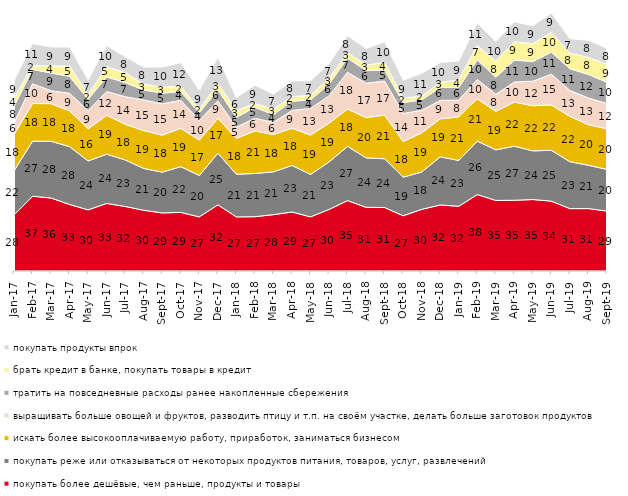
| Category | покупать более дешёвые, чем раньше, продукты и товары | покупать реже или отказываться от некоторых продуктов питания, товаров, услуг, развлечений | искать более высокооплачиваемую работу, приработок, заниматься бизнесом | выращивать больше овощей и фруктов, разводить птицу и т.п. на своём участке, делать больше заготовок продуктов  | тратить на повседневные расходы ранее накопленные сбережения | брать кредит в банке, покупать товары в кредит | покупать продукты впрок |
|---|---|---|---|---|---|---|---|
| 2017-01-01 | 27.5 | 21.65 | 17.8 | 5.7 | 8.15 | 3.75 | 8.85 |
| 2017-02-01 | 36.7 | 27 | 18.45 | 9.7 | 7.05 | 1.85 | 10.8 |
| 2017-03-01 | 35.8 | 27.85 | 18.45 | 6.35 | 8.7 | 3.5 | 9.25 |
| 2017-04-01 | 32.65 | 28.35 | 17.55 | 8.6 | 8.35 | 4.95 | 9.4 |
| 2017-05-01 | 30 | 24 | 15.75 | 8.9 | 5.6 | 2.2 | 7.3 |
| 2017-06-01 | 33.15 | 24.15 | 19.1 | 11.65 | 7.2 | 5 | 10.35 |
| 2017-07-01 | 31.65 | 22.85 | 17.5 | 13.5 | 6.9 | 4.95 | 7.75 |
| 2017-08-01 | 29.8 | 20.5 | 18.6 | 15 | 4.95 | 2.75 | 8.45 |
| 2017-09-01 | 28.5 | 20 | 18.15 | 15.35 | 5.25 | 3 | 9.85 |
| 2017-10-01 | 28.75 | 22.45 | 18.8 | 13.75 | 4.3 | 2.45 | 11.7 |
| 2017-11-01 | 26.55 | 20.3 | 17.4 | 9.6 | 3.8 | 1.7 | 9.3 |
| 2017-12-01 | 32.45 | 25.35 | 17.1 | 8.55 | 5.55 | 3.05 | 12.7 |
| 2018-01-01 | 26.55 | 20.95 | 17.6 | 5.45 | 4.85 | 3.3 | 6.35 |
| 2018-02-01 | 26.65 | 21.2 | 20.85 | 6.25 | 5.35 | 1.85 | 9 |
| 2018-03-01 | 27.65 | 21 | 18.3 | 5.95 | 3.85 | 2.65 | 7.35 |
| 2018-04-01 | 28.95 | 22.85 | 18.25 | 8.7 | 4.55 | 2.35 | 7.55 |
| 2018-05-01 | 26.55 | 20.85 | 19.3 | 13.05 | 4.2 | 2.15 | 7.25 |
| 2018-06-01 | 30.2 | 23.3 | 19.05 | 13.35 | 5.8 | 2.8 | 7.2 |
| 2018-07-01 | 34.55 | 26.6 | 18.3 | 18.05 | 6.95 | 2.75 | 8.25 |
| 2018-08-01 | 31.25 | 24.25 | 19.75 | 16.85 | 6.2 | 2.7 | 8.15 |
| 2018-09-01 | 31.15 | 23.9 | 21.45 | 16.7 | 5.45 | 3.7 | 10.1 |
| 2018-10-01 | 27.1 | 18.95 | 17.5 | 13.75 | 5.3 | 2.2 | 8.8 |
| 2018-11-01 | 30.24 | 18.313 | 19.212 | 11.078 | 5.14 | 1.796 | 11.178 |
| 2018-12-01 | 32.4 | 23.6 | 18.65 | 9.05 | 6.35 | 2.5 | 9.7 |
| 2019-01-01 | 31.75 | 22.5 | 21.35 | 8.25 | 6.25 | 3.65 | 9.25 |
| 2019-02-01 | 37.5 | 26.25 | 20.7 | 9.5 | 9.7 | 7.05 | 10.95 |
| 2019-03-01 | 34.61 | 24.814 | 18.896 | 8.354 | 8.404 | 7.857 | 9.697 |
| 2019-04-01 | 34.703 | 26.535 | 21.634 | 9.851 | 10.743 | 9.01 | 9.752 |
| 2019-05-01 | 35.067 | 23.873 | 22.14 | 12.036 | 9.658 | 8.717 | 8.816 |
| 2019-06-01 | 34.264 | 24.938 | 22.244 | 15.112 | 10.873 | 9.676 | 9.476 |
| 2019-07-01 | 30.594 | 23.02 | 22.228 | 12.723 | 10.693 | 7.624 | 7.03 |
| 2019-08-01 | 30.619 | 21.229 | 19.93 | 13.087 | 11.538 | 8.392 | 8.392 |
| 2019-09-01 | 29.406 | 20.446 | 19.901 | 12.426 | 10.396 | 8.911 | 7.673 |